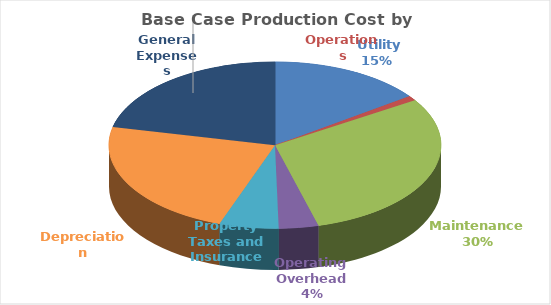
| Category | Series 0 |
|---|---|
|  Utility  | 5.731 |
| Operations | 0.365 |
| Maintenance  | 11.434 |
| Operating Overhead  | 1.475 |
| Property Taxes and Insurance | 2.209 |
| Depreciation | 8.837 |
| General Expenses | 8.23 |